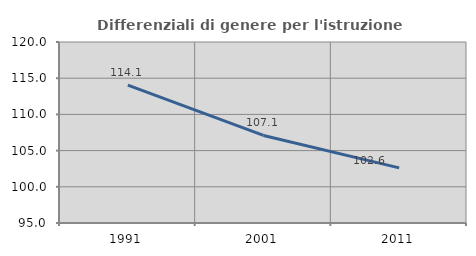
| Category | Differenziali di genere per l'istruzione superiore |
|---|---|
| 1991.0 | 114.053 |
| 2001.0 | 107.09 |
| 2011.0 | 102.613 |